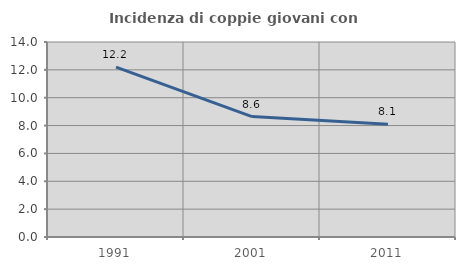
| Category | Incidenza di coppie giovani con figli |
|---|---|
| 1991.0 | 12.195 |
| 2001.0 | 8.647 |
| 2011.0 | 8.088 |